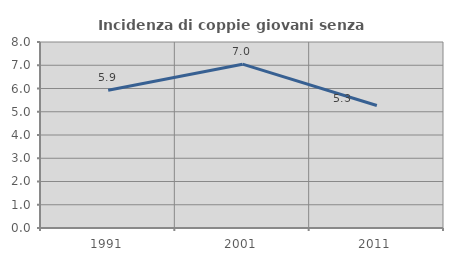
| Category | Incidenza di coppie giovani senza figli |
|---|---|
| 1991.0 | 5.923 |
| 2001.0 | 7.046 |
| 2011.0 | 5.266 |